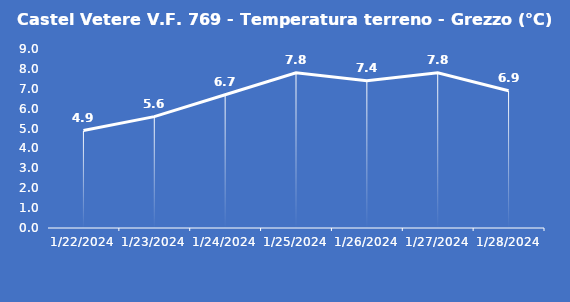
| Category | Castel Vetere V.F. 769 - Temperatura terreno - Grezzo (°C) |
|---|---|
| 1/22/24 | 4.9 |
| 1/23/24 | 5.6 |
| 1/24/24 | 6.7 |
| 1/25/24 | 7.8 |
| 1/26/24 | 7.4 |
| 1/27/24 | 7.8 |
| 1/28/24 | 6.9 |